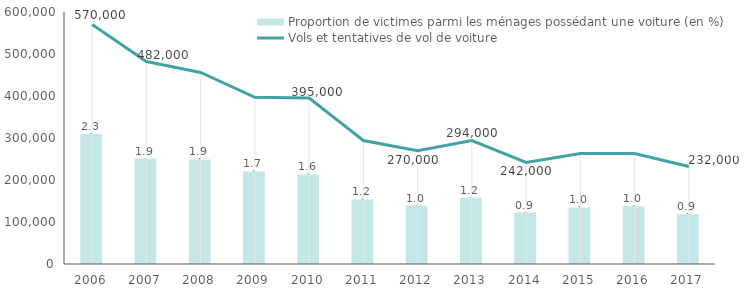
| Category | Proportion de victimes parmi les ménages possédant une voiture (en %) |
|---|---|
| 0 | 2.32 |
| 1 | 1.882 |
| 2 | 1.868 |
| 3 | 1.654 |
| 4 | 1.599 |
| 5 | 1.154 |
| 6 | 1.044 |
| 7 | 1.182 |
| 8 | 0.917 |
| 9 | 1.009 |
| 10 | 1.03 |
| 11 | 0.887 |